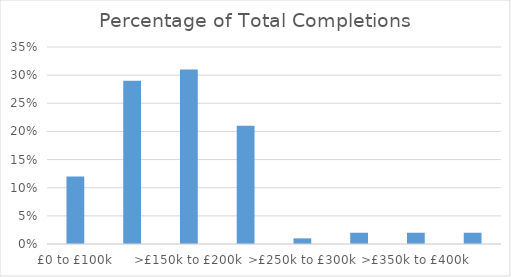
| Category | Series 0 |
|---|---|
| £0 to £100k | 0.12 |
| >£100k to £150k | 0.29 |
| >£150k to £200k | 0.31 |
| >£200k to £250k | 0.21 |
| >£250k to £300k | 0.01 |
| >£300k to £350k | 0.02 |
| >£350k to £400k | 0.02 |
| >£400k to £450k | 0.02 |